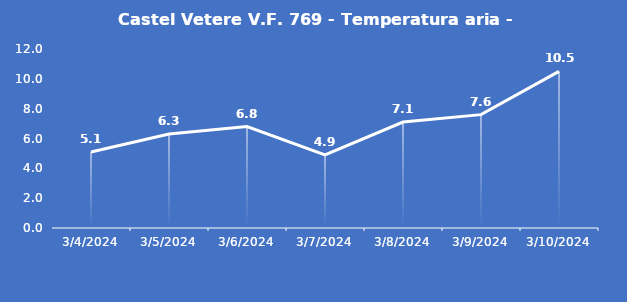
| Category | Castel Vetere V.F. 769 - Temperatura aria - Grezzo (°C) |
|---|---|
| 3/4/24 | 5.1 |
| 3/5/24 | 6.3 |
| 3/6/24 | 6.8 |
| 3/7/24 | 4.9 |
| 3/8/24 | 7.1 |
| 3/9/24 | 7.6 |
| 3/10/24 | 10.5 |